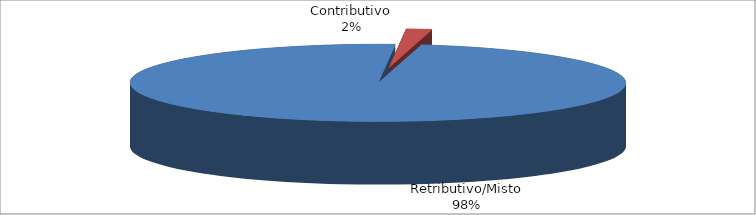
| Category | Decorrenti gennaio - marzo 2023 |
|---|---|
| Retributivo/Misto | 18588 |
| Contributivo | 317 |